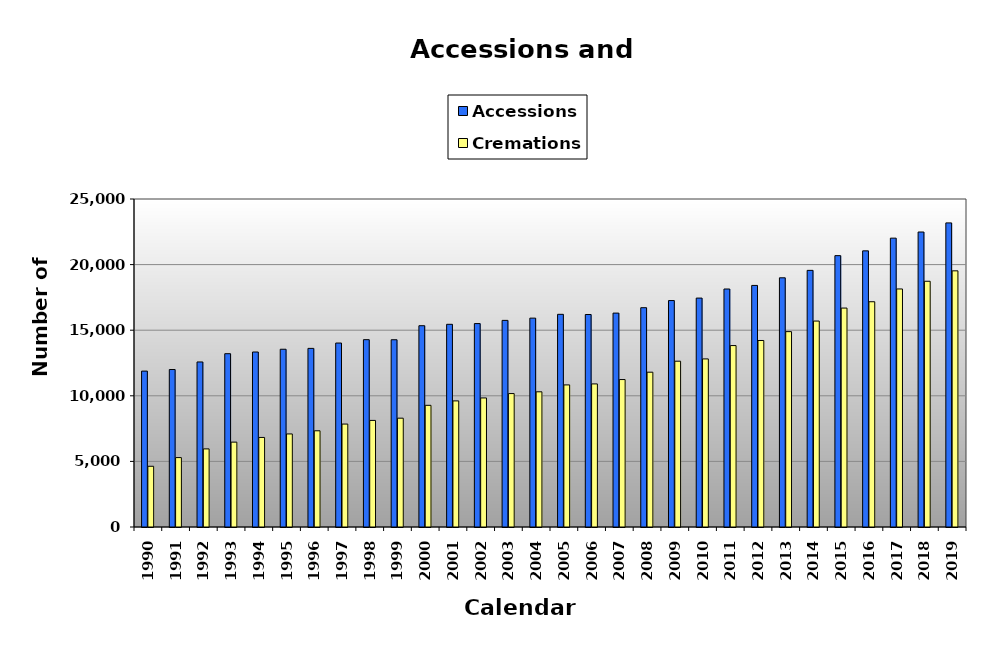
| Category | Accessions | Cremations |
|---|---|---|
| 1990.0 | 11882 | 4628 |
| 1991.0 | 12003 | 5291 |
| 1992.0 | 12579 | 5953 |
| 1993.0 | 13209 | 6469 |
| 1994.0 | 13338 | 6826 |
| 1995.0 | 13549 | 7092 |
| 1996.0 | 13614 | 7333 |
| 1997.0 | 14022 | 7845 |
| 1998.0 | 14279 | 8124 |
| 1999.0 | 14273 | 8294 |
| 2000.0 | 15342 | 9274 |
| 2001.0 | 15449 | 9611 |
| 2002.0 | 15504 | 9836 |
| 2003.0 | 15748 | 10170 |
| 2004.0 | 15920 | 10305 |
| 2005.0 | 16210 | 10830 |
| 2006.0 | 16196 | 10906 |
| 2007.0 | 16303 | 11238 |
| 2008.0 | 16715 | 11799 |
| 2009.0 | 17259 | 12637 |
| 2010.0 | 17448 | 12811 |
| 2011.0 | 18140 | 13828 |
| 2012.0 | 18412 | 14216 |
| 2013.0 | 18993 | 14891 |
| 2014.0 | 19560 | 15697 |
| 2015.0 | 20683 | 16687 |
| 2016.0 | 21048 | 17169 |
| 2017.0 | 22016 | 18143 |
| 2018.0 | 22484 | 18730 |
| 2019.0 | 23178 | 19525 |